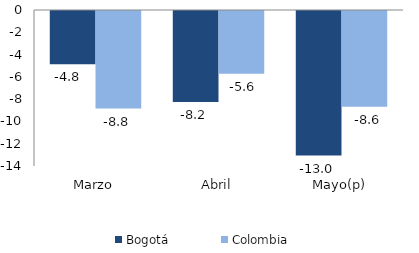
| Category | Bogotá | Colombia |
|---|---|---|
| Marzo | -4.785 | -8.76 |
| Abril | -8.163 | -5.64 |
| Mayo(p) | -12.975 | -8.602 |